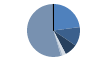
| Category | Series 0 |
|---|---|
| ARRASTRE | 324 |
| CERCO | 164 |
| PALANGRE | 110 |
| REDES DE ENMALLE | 30 |
| ARTES FIJAS | 14 |
| ARTES MENORES | 770 |
| SIN TIPO ASIGNADO | 1 |